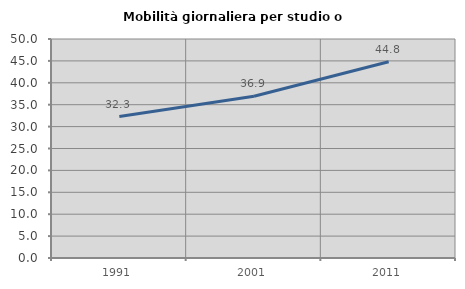
| Category | Mobilità giornaliera per studio o lavoro |
|---|---|
| 1991.0 | 32.304 |
| 2001.0 | 36.937 |
| 2011.0 | 44.802 |